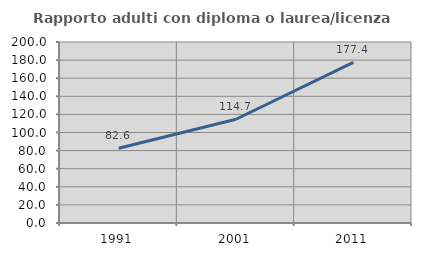
| Category | Rapporto adulti con diploma o laurea/licenza media  |
|---|---|
| 1991.0 | 82.558 |
| 2001.0 | 114.655 |
| 2011.0 | 177.419 |